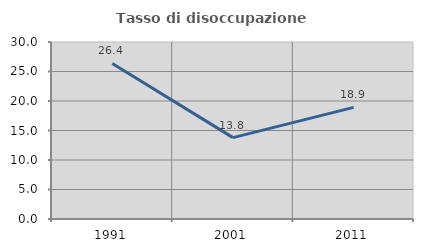
| Category | Tasso di disoccupazione giovanile  |
|---|---|
| 1991.0 | 26.357 |
| 2001.0 | 13.793 |
| 2011.0 | 18.919 |